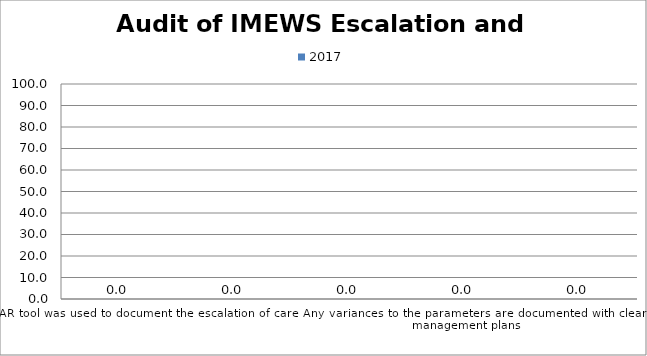
| Category | 2017 |
|---|---|
| The ISBAR tool was used to document the escalation of care | 0 |
| There is evidence of an increase in the frequency of monitoring and recording of vital signs in response to the detection of observations in the yellow or pink zones | 0 |
| Measures implemented to reduce triggers as appropriate | 0 |
| Any variances to the parameters are documented with clear management plans | 0 |
| Medical review documented by the doctor | 0 |